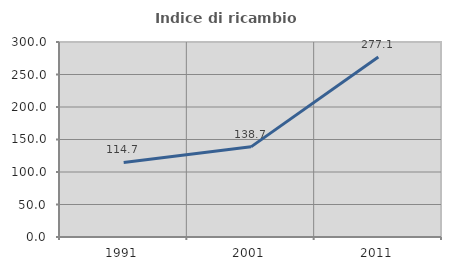
| Category | Indice di ricambio occupazionale  |
|---|---|
| 1991.0 | 114.725 |
| 2001.0 | 138.68 |
| 2011.0 | 277.076 |